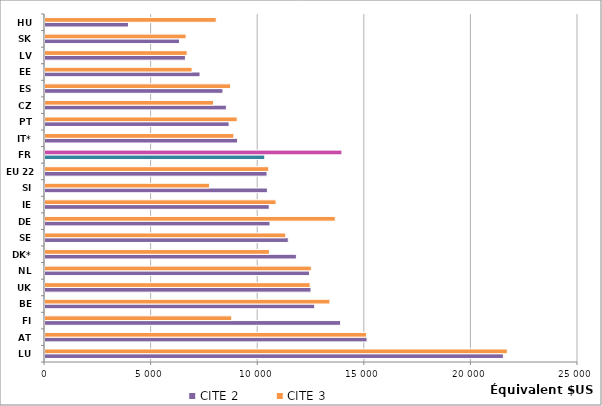
| Category | CITE 2 | CITE 3 |
|---|---|---|
| LU | 21499.061 | 21681.566 |
| AT | 15106.334 | 15079.371 |
| FI | 13864.614 | 8759.44 |
| BE | 12648.985 | 13363.416 |
| UK | 12477.629 | 12434.713 |
| NL | 12404.484 | 12491.179 |
| DK* | 11791.563 | 10525.81 |
| SE | 11411.327 | 11290.95 |
| DE | 10554.145 | 13615.463 |
| IE | 10517.599 | 10837.147 |
| SI | 10432.256 | 7715.751 |
| EU 22 | 10413.236 | 10493.768 |
| FR | 10309.184 | 13927.392 |
| IT* | 9033.334 | 8858.658 |
| PT | 8633.61 | 9014.727 |
| CZ | 8506.928 | 7904.519 |
| ES | 8347.133 | 8703.853 |
| EE | 7271.714 | 6900.129 |
| LV | 6587.027 | 6664.957 |
| SK | 6308.194 | 6617.902 |
| HU | 3914.999 | 8032.941 |